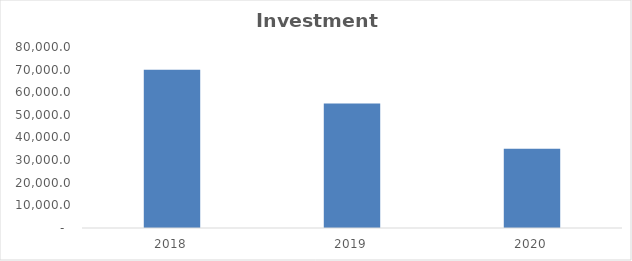
| Category | Investment plan |
|---|---|
| 2018.0 | 70000 |
| 2019.0 | 55000 |
| 2020.0 | 35000 |